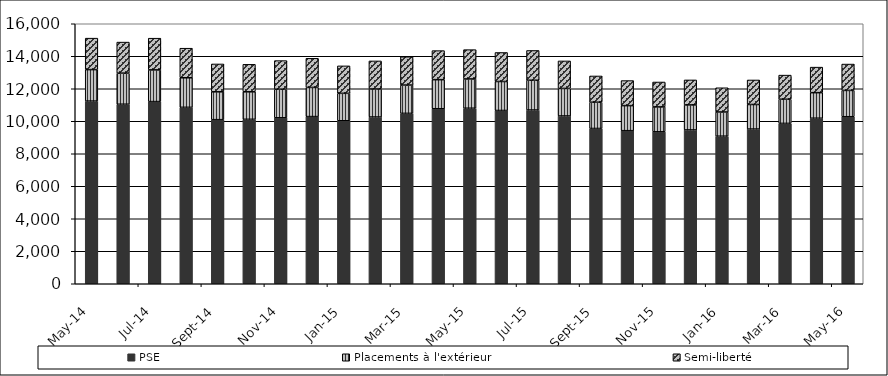
| Category | PSE | Placements à l'extérieur | Semi-liberté |
|---|---|---|---|
| 2014-05-01 | 11241 | 1937 | 1937 |
| 2014-06-01 | 11048 | 1912 | 1912 |
| 2014-07-01 | 11210 | 1951 | 1951 |
| 2014-08-01 | 10856 | 1820 | 1820 |
| 2014-09-01 | 10098 | 1714 | 1714 |
| 2014-10-01 | 10120 | 1692 | 1692 |
| 2014-11-01 | 10213 | 1760 | 1760 |
| 2014-12-01 | 10287 | 1794 | 1794 |
| 2015-01-01 | 10030 | 1689 | 1689 |
| 2015-02-01 | 10261 | 1726 | 1726 |
| 2015-03-01 | 10485 | 1742 | 1742 |
| 2015-04-01 | 10770 | 1789 | 1789 |
| 2015-05-01 | 10801 | 1803 | 1803 |
| 2015-06-01 | 10662 | 1785 | 1785 |
| 2015-07-01 | 10692 | 1832 | 1832 |
| 2015-08-01 | 10325 | 1694 | 1694 |
| 2015-09-01 | 9555 | 1616 | 1616 |
| 2015-10-01 | 9420 | 1542 | 1542 |
| 2015-11-01 | 9350 | 1533 | 1533 |
| 2015-12-01 | 9466 | 1539 | 1539 |
| 2016-01-01 | 9081 | 1490 | 1490 |
| 2016-02-01 | 9521 | 1510 | 1510 |
| 2016-03-01 | 9868 | 1486 | 1486 |
| 2016-04-01 | 10187 | 1572 | 1572 |
| 2016-05-01 | 10278 | 1621 | 1621 |